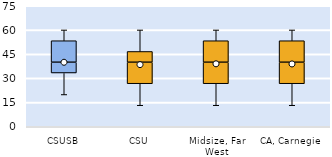
| Category | 25th | 50th | 75th |
|---|---|---|---|
| CSUSB | 33.333 | 6.667 | 13.333 |
| CSU | 26.667 | 13.333 | 6.667 |
| Midsize, Far West | 26.667 | 13.333 | 13.333 |
| CA, Carnegie | 26.667 | 13.333 | 13.333 |